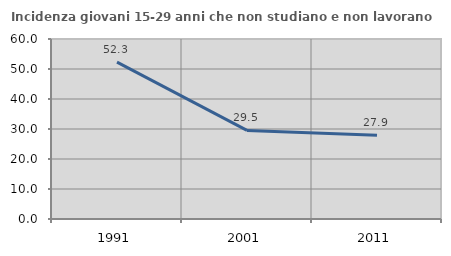
| Category | Incidenza giovani 15-29 anni che non studiano e non lavorano  |
|---|---|
| 1991.0 | 52.314 |
| 2001.0 | 29.528 |
| 2011.0 | 27.934 |